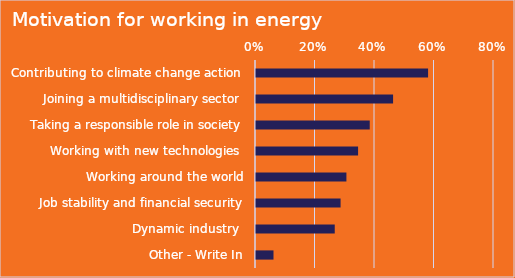
| Category | Series 0 |
|---|---|
| Contributing to climate change action  | 0.578 |
| Joining a multidisciplinary sector  | 0.461 |
| Taking a responsible role in society | 0.382 |
| Working with new technologies  | 0.343 |
| Working around the world | 0.304 |
| Job stability and financial security | 0.284 |
| Dynamic industry  | 0.265 |
| Other - Write In | 0.059 |